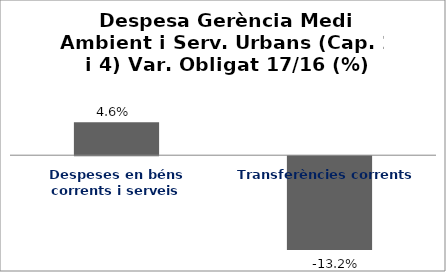
| Category | Series 0 |
|---|---|
| Despeses en béns corrents i serveis | 0.046 |
| Transferències corrents | -0.132 |